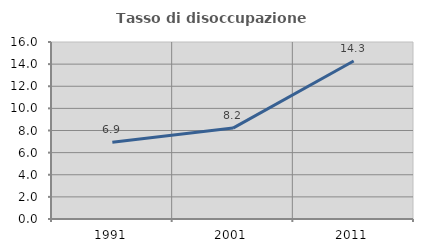
| Category | Tasso di disoccupazione giovanile  |
|---|---|
| 1991.0 | 6.931 |
| 2001.0 | 8.219 |
| 2011.0 | 14.286 |